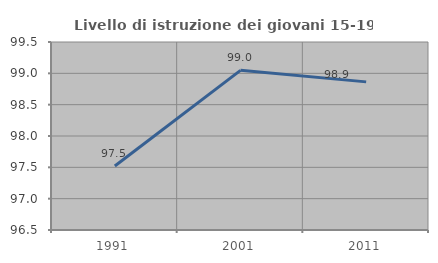
| Category | Livello di istruzione dei giovani 15-19 anni |
|---|---|
| 1991.0 | 97.521 |
| 2001.0 | 99.048 |
| 2011.0 | 98.864 |